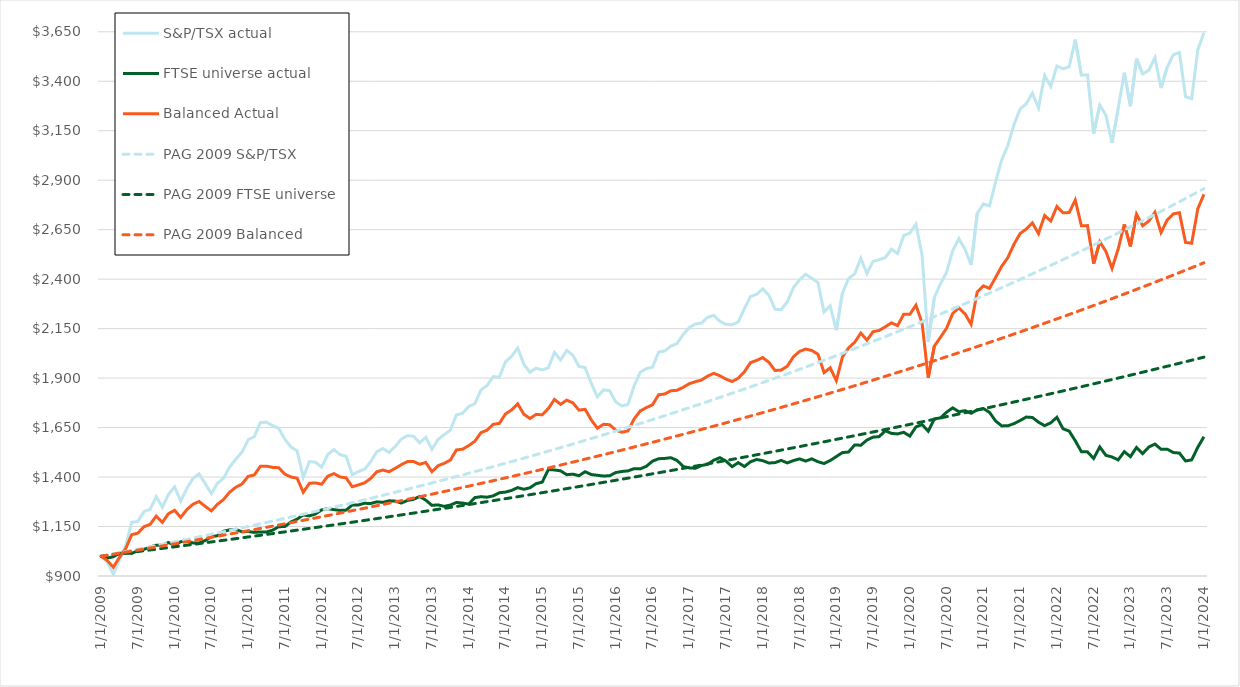
| Category | S&P/TSX actual | FTSE universe actual | Balanced Actual | PAG 2009 S&P/TSX | PAG 2009 FTSE universe | PAG 2009 Balanced |
|---|---|---|---|---|---|---|
| 1/1/09 | 1000 | 1000 | 1000 | 1000 | 1000 | 1000 |
| 2/1/09 | 970.389 | 990.472 | 978.422 | 1005.85 | 1003.875 | 1005.065 |
| 3/1/09 | 909.15 | 997.266 | 944.396 | 1011.734 | 1007.764 | 1010.155 |
| 4/1/09 | 979.96 | 1015.227 | 994.067 | 1017.652 | 1011.669 | 1015.272 |
| 5/1/09 | 1051.114 | 1015.453 | 1036.85 | 1023.605 | 1015.589 | 1020.414 |
| 6/1/09 | 1171.605 | 1014.099 | 1108.603 | 1029.593 | 1019.524 | 1025.582 |
| 7/1/09 | 1175.638 | 1027.942 | 1116.56 | 1035.616 | 1023.474 | 1030.776 |
| 8/1/09 | 1225.223 | 1034.744 | 1149.031 | 1041.674 | 1027.44 | 1035.997 |
| 9/1/09 | 1236.826 | 1046.409 | 1160.659 | 1047.767 | 1031.421 | 1041.244 |
| 10/1/09 | 1300.415 | 1055.838 | 1202.584 | 1053.897 | 1035.418 | 1046.518 |
| 11/1/09 | 1247.834 | 1055.218 | 1170.788 | 1060.062 | 1039.429 | 1051.818 |
| 12/1/09 | 1312.158 | 1069.3 | 1215.014 | 1066.263 | 1043.457 | 1057.146 |
| 1/1/10 | 1350.55 | 1054.103 | 1231.971 | 1072.5 | 1047.5 | 1062.5 |
| 2/1/10 | 1278.324 | 1073.523 | 1196.403 | 1078.774 | 1051.559 | 1067.881 |
| 3/1/10 | 1341.895 | 1075.166 | 1235.203 | 1085.084 | 1055.633 | 1073.29 |
| 4/1/10 | 1392.993 | 1067.358 | 1262.739 | 1091.432 | 1059.723 | 1078.726 |
| 5/1/10 | 1416.196 | 1066.704 | 1276.399 | 1097.816 | 1063.83 | 1084.19 |
| 6/1/10 | 1366.937 | 1079.247 | 1251.861 | 1104.238 | 1067.952 | 1089.681 |
| 7/1/10 | 1316.175 | 1098.634 | 1229.159 | 1110.698 | 1072.09 | 1095.2 |
| 8/1/10 | 1368.282 | 1103.722 | 1262.458 | 1117.195 | 1076.244 | 1100.747 |
| 9/1/10 | 1394.237 | 1125.929 | 1286.913 | 1123.73 | 1080.414 | 1106.322 |
| 10/1/10 | 1451.235 | 1133.263 | 1324.046 | 1130.304 | 1084.6 | 1111.925 |
| 11/1/10 | 1490.571 | 1135.796 | 1348.661 | 1136.916 | 1088.802 | 1117.557 |
| 12/1/10 | 1525.903 | 1123.379 | 1364.893 | 1143.567 | 1093.021 | 1123.217 |
| 1/1/11 | 1588.325 | 1125.195 | 1403.073 | 1150.256 | 1097.256 | 1128.906 |
| 2/1/11 | 1603.988 | 1120.233 | 1410.486 | 1156.985 | 1101.508 | 1134.624 |
| 3/1/11 | 1675.155 | 1122.807 | 1454.216 | 1163.753 | 1105.776 | 1140.371 |
| 4/1/11 | 1677.242 | 1122.121 | 1455.194 | 1170.561 | 1110.06 | 1146.146 |
| 5/1/11 | 1660.106 | 1131.702 | 1448.744 | 1177.408 | 1114.361 | 1151.951 |
| 6/1/11 | 1645.706 | 1149.176 | 1447.094 | 1184.296 | 1118.679 | 1157.786 |
| 7/1/11 | 1590.9 | 1149.934 | 1414.514 | 1191.223 | 1123.014 | 1163.65 |
| 8/1/11 | 1551.154 | 1173.429 | 1400.064 | 1198.192 | 1127.365 | 1169.544 |
| 9/1/11 | 1532.403 | 1187.243 | 1394.339 | 1205.201 | 1131.733 | 1175.467 |
| 10/1/11 | 1399.676 | 1208.765 | 1323.311 | 1212.251 | 1136.118 | 1181.421 |
| 11/1/11 | 1478.156 | 1203.545 | 1368.312 | 1219.342 | 1140.52 | 1187.404 |
| 12/1/11 | 1475.034 | 1213.612 | 1370.465 | 1226.475 | 1144.94 | 1193.418 |
| 1/1/12 | 1449.973 | 1234.047 | 1363.603 | 1233.65 | 1149.376 | 1199.463 |
| 2/1/12 | 1513.379 | 1240.31 | 1404.152 | 1240.866 | 1153.829 | 1205.538 |
| 3/1/12 | 1538.704 | 1235.363 | 1417.368 | 1248.125 | 1158.3 | 1211.644 |
| 4/1/12 | 1513.622 | 1231.43 | 1400.745 | 1255.426 | 1162.788 | 1217.781 |
| 5/1/12 | 1504.596 | 1233.003 | 1395.959 | 1262.77 | 1167.294 | 1223.948 |
| 6/1/12 | 1412.214 | 1259 | 1350.929 | 1270.157 | 1171.816 | 1230.148 |
| 7/1/12 | 1427.763 | 1259.129 | 1360.309 | 1277.587 | 1176.357 | 1236.378 |
| 8/1/12 | 1439.188 | 1267.466 | 1370.499 | 1285.061 | 1180.915 | 1242.64 |
| 9/1/12 | 1477.294 | 1266.165 | 1392.842 | 1292.578 | 1185.491 | 1248.934 |
| 10/1/12 | 1527.962 | 1274.688 | 1426.652 | 1300.139 | 1190.084 | 1255.26 |
| 11/1/12 | 1544.286 | 1272.271 | 1435.48 | 1307.745 | 1194.695 | 1261.617 |
| 12/1/12 | 1524.486 | 1280.179 | 1426.763 | 1315.395 | 1199.324 | 1268.007 |
| 1/1/13 | 1554.195 | 1278.477 | 1443.908 | 1323.089 | 1203.971 | 1274.429 |
| 2/1/13 | 1591.657 | 1268.796 | 1462.513 | 1330.829 | 1208.636 | 1280.884 |
| 3/1/13 | 1609.15 | 1281.666 | 1478.156 | 1338.614 | 1213.319 | 1287.372 |
| 4/1/13 | 1606.052 | 1287.343 | 1478.568 | 1346.445 | 1218.021 | 1293.892 |
| 5/1/13 | 1572.791 | 1302.043 | 1464.492 | 1354.321 | 1222.74 | 1300.445 |
| 6/1/13 | 1600.631 | 1282.996 | 1473.577 | 1362.244 | 1227.478 | 1307.032 |
| 7/1/13 | 1540.502 | 1256.998 | 1427.101 | 1370.212 | 1232.234 | 1313.652 |
| 8/1/13 | 1589.598 | 1259.358 | 1457.502 | 1378.228 | 1237.008 | 1320.305 |
| 9/1/13 | 1614.21 | 1251.865 | 1469.272 | 1386.29 | 1241.801 | 1326.992 |
| 10/1/13 | 1636.779 | 1258.414 | 1485.433 | 1394.399 | 1246.613 | 1333.713 |
| 11/1/13 | 1714.103 | 1271.642 | 1537.118 | 1402.556 | 1251.443 | 1340.468 |
| 12/1/13 | 1721.861 | 1268.639 | 1540.572 | 1410.761 | 1256.292 | 1347.258 |
| 1/1/14 | 1756.114 | 1263.219 | 1558.956 | 1419.013 | 1261.16 | 1354.081 |
| 2/1/14 | 1770.448 | 1296.109 | 1580.712 | 1427.314 | 1266.047 | 1360.939 |
| 3/1/14 | 1839.96 | 1300.642 | 1624.233 | 1435.664 | 1270.952 | 1367.832 |
| 4/1/14 | 1862.552 | 1298.168 | 1636.798 | 1444.062 | 1275.877 | 1374.76 |
| 5/1/14 | 1907.701 | 1304.746 | 1666.519 | 1452.509 | 1280.82 | 1381.723 |
| 6/1/14 | 1904.562 | 1320.719 | 1671.025 | 1461.006 | 1285.783 | 1388.721 |
| 7/1/14 | 1982.003 | 1324.065 | 1718.828 | 1469.553 | 1290.765 | 1395.755 |
| 8/1/14 | 2010.162 | 1332.417 | 1739.064 | 1478.149 | 1295.766 | 1402.824 |
| 9/1/14 | 2052.135 | 1346.631 | 1769.933 | 1486.796 | 1300.787 | 1409.929 |
| 10/1/14 | 1970.33 | 1338.151 | 1717.458 | 1495.493 | 1305.827 | 1417.07 |
| 11/1/14 | 1929.571 | 1345.773 | 1696.052 | 1504.242 | 1310.887 | 1424.248 |
| 12/1/14 | 1950.05 | 1366.608 | 1716.673 | 1513.041 | 1315.966 | 1431.461 |
| 1/1/15 | 1941.448 | 1374.258 | 1714.572 | 1521.892 | 1321.065 | 1438.711 |
| 2/1/15 | 1952.105 | 1437.836 | 1746.398 | 1530.795 | 1326.184 | 1445.998 |
| 3/1/15 | 2029.771 | 1435.906 | 1792.225 | 1539.749 | 1331.322 | 1453.322 |
| 4/1/15 | 1991.613 | 1431.344 | 1767.505 | 1548.756 | 1336.481 | 1460.683 |
| 5/1/15 | 2039.96 | 1411.853 | 1788.717 | 1557.816 | 1341.659 | 1468.081 |
| 6/1/15 | 2015.117 | 1414.684 | 1774.944 | 1566.929 | 1346.858 | 1475.516 |
| 7/1/15 | 1959.052 | 1406.834 | 1738.165 | 1576.095 | 1352.076 | 1482.99 |
| 8/1/15 | 1952.869 | 1427.04 | 1742.537 | 1585.315 | 1357.315 | 1490.501 |
| 9/1/15 | 1874.032 | 1412.697 | 1689.498 | 1594.589 | 1362.574 | 1498.05 |
| 10/1/15 | 1805.164 | 1408.879 | 1646.65 | 1603.917 | 1367.854 | 1505.637 |
| 11/1/15 | 1840.471 | 1405.261 | 1666.387 | 1613.299 | 1373.154 | 1513.263 |
| 12/1/15 | 1836.236 | 1406.676 | 1664.412 | 1622.736 | 1378.474 | 1520.927 |
| 1/1/16 | 1779.949 | 1422.635 | 1637.024 | 1632.229 | 1383.816 | 1528.631 |
| 2/1/16 | 1759.146 | 1428.169 | 1626.756 | 1641.777 | 1389.177 | 1536.373 |
| 3/1/16 | 1767.379 | 1431.23 | 1632.919 | 1651.381 | 1394.56 | 1544.154 |
| 4/1/16 | 1860.752 | 1442.469 | 1693.439 | 1661.041 | 1399.964 | 1551.975 |
| 5/1/16 | 1929.174 | 1441.325 | 1734.035 | 1670.758 | 1405.388 | 1559.836 |
| 6/1/16 | 1948.393 | 1454.424 | 1750.805 | 1680.531 | 1410.833 | 1567.736 |
| 7/1/16 | 1955.062 | 1480.207 | 1765.12 | 1690.362 | 1416.3 | 1575.676 |
| 8/1/16 | 2031.434 | 1492.691 | 1815.937 | 1700.25 | 1421.788 | 1583.657 |
| 9/1/16 | 2036.859 | 1494.049 | 1819.735 | 1710.196 | 1427.297 | 1591.678 |
| 10/1/16 | 2061.694 | 1497.753 | 1836.118 | 1720.201 | 1432.827 | 1599.74 |
| 11/1/16 | 2074.431 | 1484.168 | 1838.326 | 1730.263 | 1438.379 | 1607.842 |
| 12/1/16 | 2119.944 | 1453.509 | 1853.37 | 1740.385 | 1443.952 | 1615.985 |
| 1/1/17 | 2155.197 | 1446.287 | 1871.633 | 1750.566 | 1449.547 | 1624.17 |
| 2/1/17 | 2173.486 | 1444.529 | 1881.903 | 1760.806 | 1455.163 | 1632.396 |
| 3/1/17 | 2178.097 | 1458.328 | 1890.189 | 1771.106 | 1460.802 | 1640.664 |
| 4/1/17 | 2207.217 | 1464.248 | 1910.029 | 1781.467 | 1466.462 | 1648.974 |
| 5/1/17 | 2216.919 | 1485.255 | 1924.253 | 1791.888 | 1472.144 | 1657.326 |
| 6/1/17 | 2187.542 | 1497.982 | 1911.718 | 1802.37 | 1477.848 | 1665.72 |
| 7/1/17 | 2171.043 | 1480.479 | 1894.818 | 1812.913 | 1483.574 | 1674.156 |
| 8/1/17 | 2169.719 | 1452.322 | 1882.76 | 1823.518 | 1489.323 | 1682.636 |
| 9/1/17 | 2184.209 | 1472.771 | 1899.634 | 1834.186 | 1495.093 | 1691.158 |
| 10/1/17 | 2251.033 | 1453.28 | 1931.932 | 1844.915 | 1500.886 | 1699.723 |
| 11/1/17 | 2312.521 | 1477.161 | 1978.377 | 1855.707 | 1506.702 | 1708.332 |
| 12/1/17 | 2323.439 | 1488.787 | 1989.578 | 1866.563 | 1512.54 | 1716.984 |
| 1/1/18 | 2351.216 | 1482.681 | 2003.802 | 1877.482 | 1518.4 | 1725.681 |
| 2/1/18 | 2318.417 | 1470.826 | 1979.381 | 1888.464 | 1524.284 | 1734.421 |
| 3/1/18 | 2248.504 | 1473 | 1938.302 | 1899.511 | 1530.19 | 1743.206 |
| 4/1/18 | 2244.952 | 1484.125 | 1940.622 | 1910.623 | 1536.119 | 1752.035 |
| 5/1/18 | 2285.838 | 1471.413 | 1960.068 | 1921.8 | 1542.071 | 1760.908 |
| 6/1/18 | 2357.046 | 1483.253 | 2007.529 | 1933.042 | 1548.046 | 1769.827 |
| 7/1/18 | 2396.96 | 1491.747 | 2034.875 | 1944.35 | 1554.044 | 1778.791 |
| 8/1/18 | 2424.525 | 1480.779 | 2047.027 | 1955.724 | 1560.065 | 1787.8 |
| 9/1/18 | 2404.643 | 1491.904 | 2039.548 | 1967.164 | 1566.11 | 1796.855 |
| 10/1/18 | 2383.256 | 1477.476 | 2020.944 | 1978.671 | 1572.178 | 1805.956 |
| 11/1/18 | 2233.725 | 1468.41 | 1927.599 | 1990.246 | 1578.27 | 1815.103 |
| 12/1/18 | 2264.666 | 1483.453 | 1952.181 | 2001.889 | 1584.385 | 1824.296 |
| 1/1/19 | 2142.281 | 1503.559 | 1886.792 | 2013.599 | 1590.524 | 1833.536 |
| 2/1/19 | 2329.416 | 1523.65 | 2007.11 | 2025.378 | 1596.687 | 1842.822 |
| 3/1/19 | 2402.749 | 1526.425 | 2052.219 | 2037.226 | 1602.874 | 1852.156 |
| 4/1/19 | 2427.096 | 1562.346 | 2081.196 | 2049.143 | 1609.084 | 1861.537 |
| 5/1/19 | 2505.267 | 1560.745 | 2127.458 | 2061.13 | 1615.319 | 1870.965 |
| 6/1/19 | 2428.506 | 1587.157 | 2091.966 | 2073.187 | 1621.578 | 1880.441 |
| 7/1/19 | 2489.836 | 1601.62 | 2134.55 | 2085.315 | 1627.861 | 1889.965 |
| 8/1/19 | 2498.382 | 1604.307 | 2140.752 | 2097.514 | 1634.168 | 1899.538 |
| 9/1/19 | 2509.235 | 1634.39 | 2159.297 | 2109.783 | 1640.5 | 1909.159 |
| 10/1/19 | 2551.598 | 1620.663 | 2179.224 | 2122.125 | 1646.857 | 1918.828 |
| 11/1/19 | 2529.664 | 1617.862 | 2164.943 | 2134.539 | 1653.238 | 1928.547 |
| 12/1/19 | 2620.47 | 1626.224 | 2222.772 | 2147.025 | 1659.644 | 1938.315 |
| 1/1/20 | 2632.371 | 1606.865 | 2222.169 | 2159.585 | 1666.074 | 1948.132 |
| 2/1/20 | 2678.29 | 1653.587 | 2268.409 | 2172.218 | 1672.53 | 1957.999 |
| 3/1/20 | 2520.229 | 1665.319 | 2178.265 | 2184.925 | 1679.01 | 1967.916 |
| 4/1/20 | 2082.306 | 1632.004 | 1902.185 | 2197.706 | 1685.516 | 1977.883 |
| 5/1/20 | 2307.031 | 1693.786 | 2061.733 | 2210.562 | 1692.047 | 1987.9 |
| 6/1/20 | 2377.152 | 1699.087 | 2105.926 | 2223.493 | 1698.603 | 1997.969 |
| 7/1/20 | 2435.698 | 1727.82 | 2152.547 | 2236.5 | 1705.184 | 2008.088 |
| 8/1/20 | 2544.89 | 1749.736 | 2226.829 | 2249.583 | 1711.792 | 2018.259 |
| 9/1/20 | 2604.656 | 1729.957 | 2254.776 | 2262.743 | 1718.424 | 2028.481 |
| 10/1/20 | 2550.957 | 1735.422 | 2224.743 | 2275.979 | 1725.083 | 2038.755 |
| 11/1/20 | 2471.514 | 1722.296 | 2171.827 | 2289.293 | 1731.767 | 2049.081 |
| 12/1/20 | 2732.699 | 1740.001 | 2335.62 | 2302.685 | 1738.477 | 2059.459 |
| 1/1/21 | 2779.789 | 1746.367 | 2366.42 | 2316.155 | 1745.213 | 2069.89 |
| 2/1/21 | 2770.828 | 1727.021 | 2353.305 | 2329.704 | 1751.975 | 2080.374 |
| 3/1/21 | 2891.766 | 1683.469 | 2408.447 | 2343.332 | 1758.763 | 2090.91 |
| 4/1/21 | 3003.633 | 1658.395 | 2465.538 | 2357.04 | 1765.578 | 2101.501 |
| 5/1/21 | 3075.412 | 1659.36 | 2508.992 | 2370.828 | 1772.419 | 2112.144 |
| 6/1/21 | 3181.308 | 1669.821 | 2576.713 | 2384.697 | 1779.287 | 2122.842 |
| 7/1/21 | 3260.255 | 1685.84 | 2630.489 | 2398.647 | 1786.181 | 2133.594 |
| 8/1/21 | 3286.445 | 1703.204 | 2653.149 | 2412.678 | 1793.102 | 2144.4 |
| 9/1/21 | 3340.109 | 1701.088 | 2684.5 | 2426.792 | 1800.049 | 2155.261 |
| 10/1/21 | 3265.807 | 1677.351 | 2630.425 | 2440.988 | 1807.024 | 2166.177 |
| 11/1/21 | 3429.605 | 1659.675 | 2721.633 | 2455.267 | 1814.026 | 2177.148 |
| 12/1/21 | 3373.991 | 1674.101 | 2694.035 | 2469.629 | 1821.054 | 2188.175 |
| 1/1/22 | 3477.264 | 1701.937 | 2767.133 | 2484.076 | 1828.11 | 2199.258 |
| 2/1/22 | 3462.951 | 1644.071 | 2735.399 | 2498.607 | 1835.194 | 2210.397 |
| 3/1/22 | 3472.645 | 1632.345 | 2736.525 | 2513.224 | 1842.305 | 2221.592 |
| 4/1/22 | 3610.012 | 1583.354 | 2799.349 | 2527.925 | 1849.443 | 2232.844 |
| 5/1/22 | 3430.886 | 1528.241 | 2669.828 | 2542.713 | 1856.609 | 2244.153 |
| 6/1/22 | 3432.843 | 1527.197 | 2670.585 | 2557.587 | 1863.803 | 2255.52 |
| 7/1/22 | 3134 | 1493.892 | 2477.957 | 2572.548 | 1871.024 | 2266.943 |
| 8/1/22 | 3279.923 | 1552.208 | 2588.837 | 2587.597 | 1878.274 | 2278.425 |
| 9/1/22 | 3227.216 | 1509.651 | 2540.19 | 2602.734 | 1885.552 | 2289.965 |
| 10/1/22 | 3089.84 | 1501.671 | 2454.573 | 2617.959 | 1892.858 | 2301.563 |
| 11/1/22 | 3261.986 | 1486.613 | 2551.837 | 2633.274 | 1900.192 | 2313.22 |
| 12/1/22 | 3442.654 | 1528.455 | 2676.975 | 2648.678 | 1907.554 | 2324.936 |
| 1/1/23 | 3274.129 | 1503.216 | 2565.763 | 2664.172 | 1914.946 | 2336.712 |
| 2/1/23 | 3514.037 | 1549.662 | 2728.287 | 2679.756 | 1922.365 | 2348.547 |
| 3/1/23 | 3437.21 | 1518.774 | 2669.836 | 2695.432 | 1929.814 | 2360.442 |
| 4/1/23 | 3455.055 | 1551.578 | 2693.665 | 2711.2 | 1937.291 | 2372.397 |
| 5/1/23 | 3518.966 | 1566.779 | 2738.091 | 2727.06 | 1944.798 | 2384.413 |
| 6/1/23 | 3365.818 | 1540.31 | 2635.615 | 2743.012 | 1952.333 | 2396.49 |
| 7/1/23 | 3470.811 | 1540.925 | 2698.857 | 2759.058 | 1959.898 | 2408.627 |
| 8/1/23 | 3533.88 | 1523.879 | 2729.88 | 2775.198 | 1967.492 | 2420.827 |
| 9/1/23 | 3544.996 | 1521.076 | 2735.428 | 2791.432 | 1975.115 | 2433.088 |
| 10/1/23 | 3321.58 | 1481.28 | 2585.46 | 2807.761 | 1982.768 | 2445.411 |
| 11/1/23 | 3311.692 | 1486.771 | 2581.723 | 2824.186 | 1990.451 | 2457.797 |
| 12/1/23 | 3558.879 | 1550.592 | 2755.564 | 2840.707 | 1998.163 | 2470.245 |
| 1/1/24 | 3645.378 | 1603.773 | 2828.736 | 2857.324 | 2005.906 | 2482.756 |